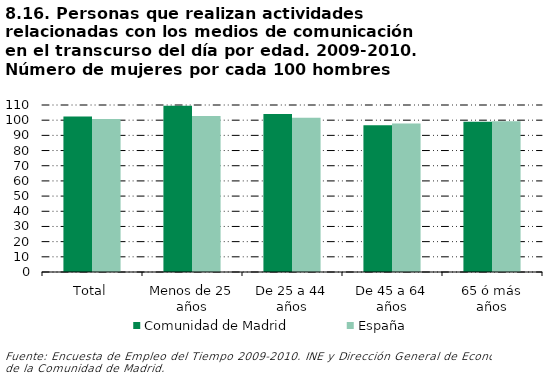
| Category | Comunidad de Madrid | España |
|---|---|---|
| Total | 102.488 | 100.795 |
| Menos de 25 años | 109.564 | 102.829 |
| De 25 a 44 años | 104.139 | 101.54 |
| De 45 a 64 años | 96.587 | 97.833 |
| 65 ó más años | 98.989 | 99.374 |